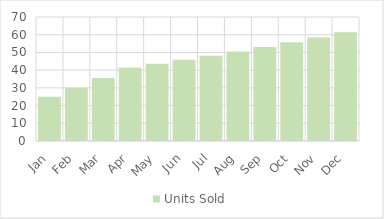
| Category | Units Sold |
|---|---|
| Jan | 25 |
| Feb | 30 |
| Mar | 35.5 |
| Apr | 41.55 |
| May | 43.628 |
| Jun | 45.809 |
| Jul | 48.099 |
| Aug | 50.504 |
| Sep | 53.029 |
| Oct | 55.681 |
| Nov | 58.465 |
| Dec | 61.388 |